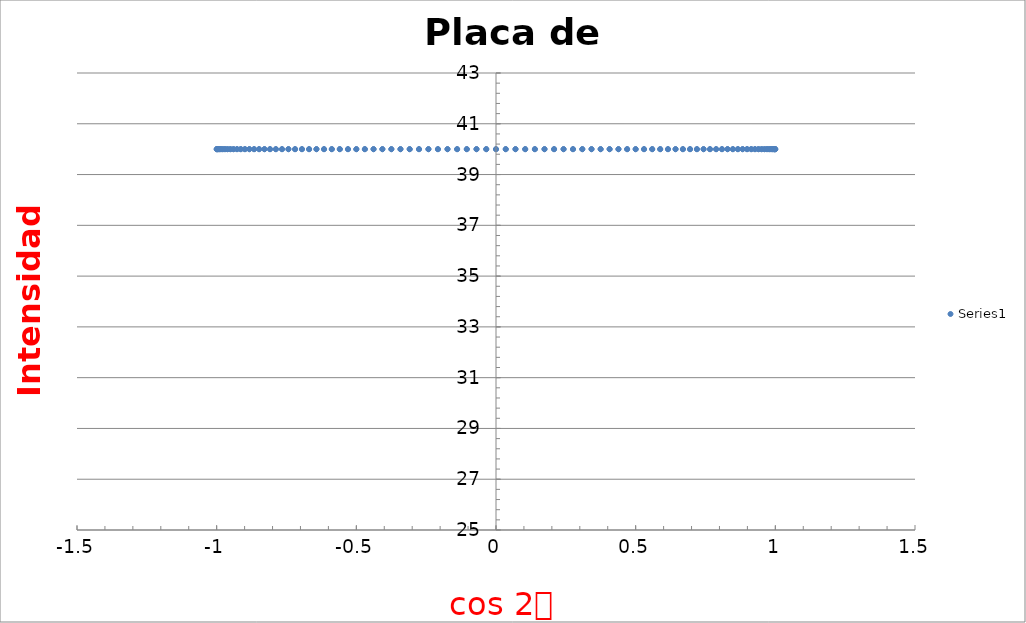
| Category | Series 0 |
|---|---|
| 0.9993908270190958 | 40 |
| 0.9975640502598242 | 40 |
| 0.9975640502598242 | 40 |
| 0.9945218953682733 | 40 |
| 0.9902680687415704 | 40 |
| 0.984807753012208 | 40 |
| 0.9781476007338057 | 40 |
| 0.9702957262759965 | 40 |
| 0.9612616959383189 | 40 |
| 0.9510565162951535 | 40 |
| 0.9396926207859084 | 40 |
| 0.9271838545667874 | 40 |
| 0.9135454576426009 | 40 |
| 0.898794046299167 | 40 |
| 0.882947592858927 | 40 |
| 0.8660254037844387 | 40 |
| 0.848048096156426 | 40 |
| 0.8290375725550416 | 40 |
| 0.8090169943749475 | 40 |
| 0.788010753606722 | 40 |
| 0.766044443118978 | 40 |
| 0.7431448254773942 | 40 |
| 0.7193398003386512 | 40 |
| 0.6946583704589974 | 40 |
| 0.6691306063588582 | 40 |
| 0.6427876096865394 | 40 |
| 0.6156614753256583 | 40 |
| 0.5877852522924731 | 40 |
| 0.5591929034707468 | 40 |
| 0.5299192642332049 | 40 |
| 0.5000000000000001 | 40 |
| 0.46947156278589086 | 40 |
| 0.43837114678907746 | 40 |
| 0.4067366430758002 | 40 |
| 0.37460659341591196 | 40 |
| 0.3420201433256688 | 40 |
| 0.30901699437494745 | 40 |
| 0.27563735581699916 | 40 |
| 0.2419218955996679 | 40 |
| 0.20791169081775945 | 40 |
| 0.17364817766693041 | 40 |
| 0.1391731009600657 | 40 |
| 0.10452846326765346 | 40 |
| 0.06975647374412546 | 40 |
| 0.03489949670250108 | 40 |
| 6.1257422745431e-17 | 40 |
| -0.03489949670250073 | 40 |
| -0.06975647374412533 | 40 |
| -0.10452846326765333 | 40 |
| -0.13917310096006535 | 40 |
| -0.1736481776669303 | 40 |
| -0.20791169081775912 | 40 |
| -0.24192189559966779 | 40 |
| -0.27563735581699905 | 40 |
| -0.30901699437494734 | 40 |
| -0.3420201433256687 | 40 |
| -0.37460659341591207 | 40 |
| -0.40673664307580004 | 40 |
| -0.4383711467890775 | 40 |
| -0.46947156278589053 | 40 |
| -0.4999999999999998 | 40 |
| -0.5299192642332048 | 40 |
| -0.5591929034707467 | 40 |
| -0.587785252292473 | 40 |
| -0.6156614753256583 | 40 |
| -0.6427876096865394 | 40 |
| -0.6691306063588582 | 40 |
| -0.694658370458997 | 40 |
| -0.7193398003386512 | 40 |
| -0.743144825477394 | 40 |
| -0.7660444431189779 | 40 |
| -0.7880107536067219 | 40 |
| -0.8090169943749473 | 40 |
| -0.8290375725550416 | 40 |
| -0.848048096156426 | 40 |
| -0.8660254037844387 | 40 |
| -0.8829475928589268 | 40 |
| -0.898794046299167 | 40 |
| -0.9135454576426008 | 40 |
| -0.9271838545667873 | 40 |
| -0.9396926207859083 | 40 |
| -0.9510565162951535 | 40 |
| -0.9612616959383187 | 40 |
| -0.9702957262759965 | 40 |
| -0.9781476007338057 | 40 |
| -0.984807753012208 | 40 |
| -0.9902680687415703 | 40 |
| -0.9945218953682733 | 40 |
| -0.9975640502598242 | 40 |
| -0.9993908270190958 | 40 |
| -1.0 | 40 |
| -0.9993908270190958 | 40 |
| -0.9975640502598243 | 40 |
| -0.9945218953682734 | 40 |
| -0.9902680687415703 | 40 |
| -0.984807753012208 | 40 |
| -0.9781476007338057 | 40 |
| -0.9702957262759965 | 40 |
| -0.9612616959383189 | 40 |
| -0.9510565162951535 | 40 |
| -0.9396926207859084 | 40 |
| -0.9271838545667874 | 40 |
| -0.9135454576426011 | 40 |
| -0.8987940462991671 | 40 |
| -0.8829475928589269 | 40 |
| -0.8660254037844386 | 40 |
| -0.8480480961564261 | 40 |
| -0.8290375725550418 | 40 |
| -0.8090169943749476 | 40 |
| -0.7880107536067222 | 40 |
| -0.766044443118978 | 40 |
| -0.7431448254773942 | 40 |
| -0.7193398003386511 | 40 |
| -0.6946583704589976 | 40 |
| -0.6691306063588585 | 40 |
| -0.6427876096865395 | 40 |
| -0.6156614753256581 | 40 |
| -0.5877852522924732 | 40 |
| -0.5591929034707472 | 40 |
| -0.529919264233205 | 40 |
| -0.5000000000000004 | 40 |
| -0.46947156278589075 | 40 |
| -0.43837114678907774 | 40 |
| -0.4067366430758001 | 40 |
| -0.3746065934159123 | 40 |
| -0.3420201433256694 | 40 |
| -0.30901699437494756 | 40 |
| -0.2756373558169989 | 40 |
| -0.24192189559966779 | 40 |
| -0.2079116908177598 | 40 |
| -0.17364817766693033 | 40 |
| -0.13917310096006494 | 40 |
| -0.10452846326765336 | 40 |
| -0.06975647374412558 | 40 |
| -0.03489949670250165 | 40 |
| -1.83772268236293e-16 | 40 |
| 0.03489949670250128 | 40 |
| 0.06975647374412522 | 40 |
| 0.10452846326765299 | 40 |
| 0.13917310096006547 | 40 |
| 0.17364817766692997 | 40 |
| 0.20791169081775857 | 40 |
| 0.24192189559966745 | 40 |
| 0.2756373558169994 | 40 |
| 0.30901699437494723 | 40 |
| 0.34202014332566816 | 40 |
| 0.37460659341591196 | 40 |
| 0.40673664307580054 | 40 |
| 0.4383711467890774 | 40 |
| 0.4694715627858904 | 40 |
| 0.5000000000000001 | 40 |
| 0.5299192642332047 | 40 |
| 0.5591929034707462 | 40 |
| 0.5877852522924729 | 40 |
| 0.6156614753256585 | 40 |
| 0.6427876096865393 | 40 |
| 0.6691306063588578 | 40 |
| 0.6946583704589966 | 40 |
| 0.7193398003386509 | 40 |
| 0.7431448254773942 | 40 |
| 0.7660444431189778 | 40 |
| 0.7880107536067216 | 40 |
| 0.8090169943749473 | 40 |
| 0.8290375725550414 | 40 |
| 0.8480480961564254 | 40 |
| 0.8660254037844384 | 40 |
| 0.8829475928589269 | 40 |
| 0.8987940462991671 | 40 |
| 0.913545457642601 | 40 |
| 0.9271838545667873 | 40 |
| 0.9396926207859084 | 40 |
| 0.9510565162951535 | 40 |
| 0.9612616959383187 | 40 |
| 0.9702957262759965 | 40 |
| 0.9781476007338056 | 40 |
| 0.9848077530122079 | 40 |
| 0.9902680687415703 | 40 |
| 0.9945218953682733 | 40 |
| 0.9975640502598243 | 40 |
| 0.9993908270190958 | 40 |
| 1.0 | 40 |